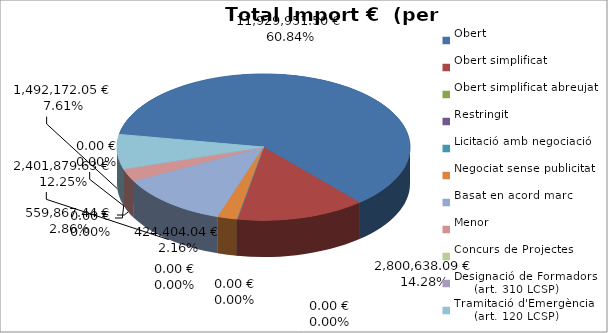
| Category | Total preu
(amb IVA) |
|---|---|
| Obert | 11929951.497 |
| Obert simplificat | 2800638.088 |
| Obert simplificat abreujat | 0 |
| Restringit | 0 |
| Licitació amb negociació | 0 |
| Negociat sense publicitat | 424404.04 |
| Basat en acord marc | 2401879.634 |
| Menor | 559867.44 |
| Concurs de Projectes | 0 |
| Designació de Formadors
     (art. 310 LCSP) | 0 |
| Tramitació d'Emergència
     (art. 120 LCSP) | 1492172.05 |